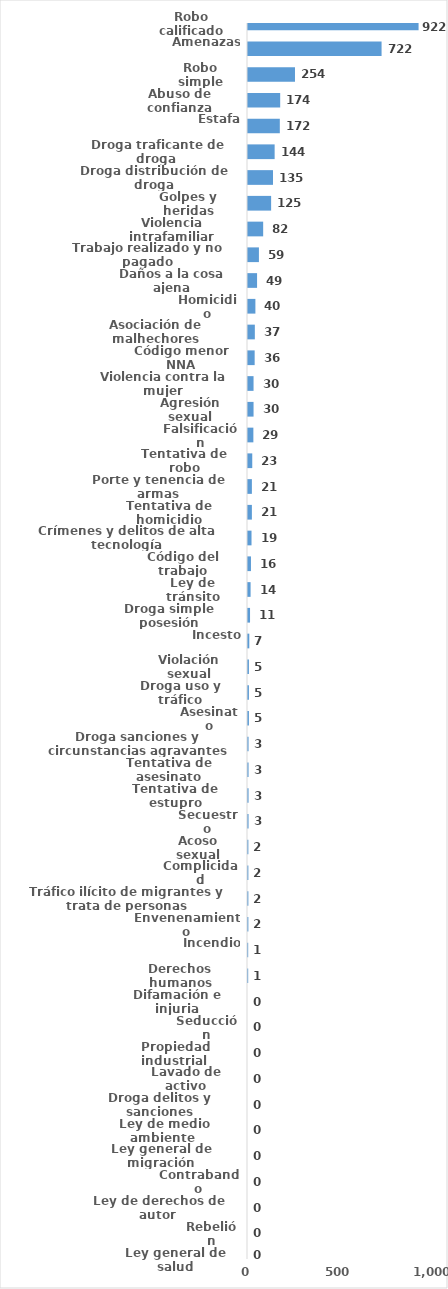
| Category | Series 0 |
|---|---|
| Robo calificado | 922 |
| Amenazas | 722 |
| Robo simple | 254 |
| Abuso de confianza | 174 |
| Estafa | 172 |
| Droga traficante de droga  | 144 |
| Droga distribución de droga | 135 |
| Golpes y heridas | 125 |
| Violencia intrafamiliar | 82 |
| Trabajo realizado y no pagado | 59 |
| Daños a la cosa ajena | 49 |
| Homicidio | 40 |
| Asociación de malhechores | 37 |
| Código menor NNA | 36 |
| Violencia contra la mujer | 30 |
| Agresión sexual | 30 |
| Falsificación | 29 |
| Tentativa de robo | 23 |
| Porte y tenencia de armas | 21 |
| Tentativa de homicidio | 21 |
| Crímenes y delitos de alta tecnología | 19 |
| Código del trabajo | 16 |
| Ley de tránsito | 14 |
| Droga simple posesión | 11 |
| Incesto | 7 |
| Violación sexual | 5 |
| Droga uso y tráfico | 5 |
| Asesinato | 5 |
| Droga sanciones y circunstancias agravantes | 3 |
| Tentativa de asesinato | 3 |
| Tentativa de estupro | 3 |
| Secuestro | 3 |
| Acoso sexual | 2 |
| Complicidad | 2 |
| Tráfico ilícito de migrantes y trata de personas | 2 |
| Envenenamiento | 2 |
| Incendio | 1 |
| Derechos humanos | 1 |
| Difamación e injuria | 0 |
| Seducción | 0 |
| Propiedad industrial  | 0 |
| Lavado de activo | 0 |
| Droga delitos y sanciones | 0 |
| Ley de medio ambiente  | 0 |
| Ley general de migración | 0 |
| Contrabando | 0 |
| Ley de derechos de autor  | 0 |
| Rebelión | 0 |
| Ley general de salud | 0 |